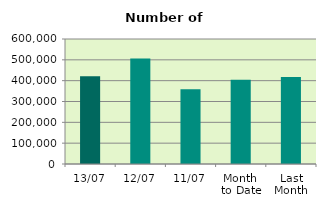
| Category | Series 0 |
|---|---|
| 13/07 | 421658 |
| 12/07 | 506614 |
| 11/07 | 358366 |
| Month 
to Date | 404832.444 |
| Last
Month | 418146.182 |